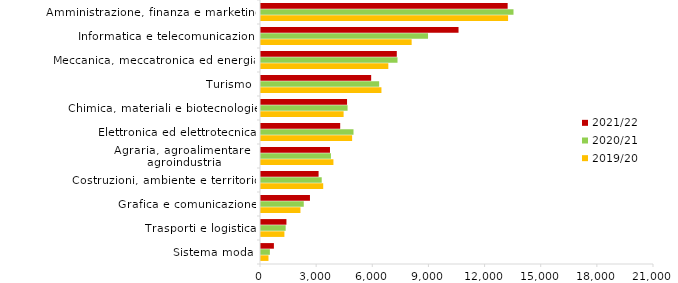
| Category | 2019/20 | 2020/21 | 2021/22 |
|---|---|---|---|
| Sistema moda | 400 | 474 | 689 |
| Trasporti e logistica | 1251 | 1318 | 1359 |
| Grafica e comunicazione | 2108 | 2285 | 2616 |
| Costruzioni, ambiente e territorio | 3324 | 3245 | 3077 |
| Agraria, agroalimentare e agroindustria | 3870 | 3737 | 3686 |
| Elettronica ed elettrotecnica | 4869 | 4943 | 4232 |
| Chimica, materiali e biotecnologie | 4414 | 4626 | 4598 |
| Turismo | 6436 | 6314 | 5887 |
| Meccanica, meccatronica ed energia | 6804 | 7294 | 7256 |
| Informatica e telecomunicazioni | 8050 | 8925 | 10555 |
| Amministrazione, finanza e marketing | 13203 | 13492 | 13180 |